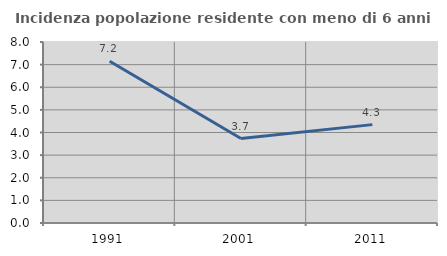
| Category | Incidenza popolazione residente con meno di 6 anni |
|---|---|
| 1991.0 | 7.152 |
| 2001.0 | 3.731 |
| 2011.0 | 4.348 |